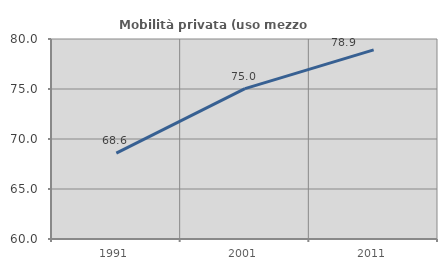
| Category | Mobilità privata (uso mezzo privato) |
|---|---|
| 1991.0 | 68.585 |
| 2001.0 | 75.033 |
| 2011.0 | 78.913 |